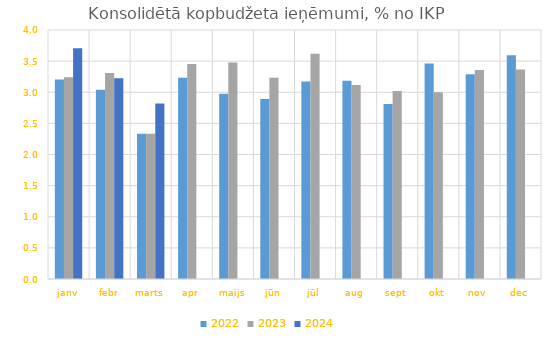
| Category | 2022 | 2023 | 2024 |
|---|---|---|---|
| janv | 3.205 | 3.241 | 3.707 |
| febr | 3.039 | 3.309 | 3.226 |
| marts | 2.335 | 2.335 | 2.817 |
| apr | 3.232 | 3.452 | 0 |
| maijs | 2.974 | 3.476 | 0 |
| jūn | 2.892 | 3.232 | 0 |
| jūl | 3.172 | 3.618 | 0 |
| aug | 3.184 | 3.118 | 0 |
| sept | 2.811 | 3.018 | 0 |
| okt | 3.461 | 2.998 | 0 |
| nov | 3.287 | 3.356 | 0 |
| dec | 3.594 | 3.367 | 0 |